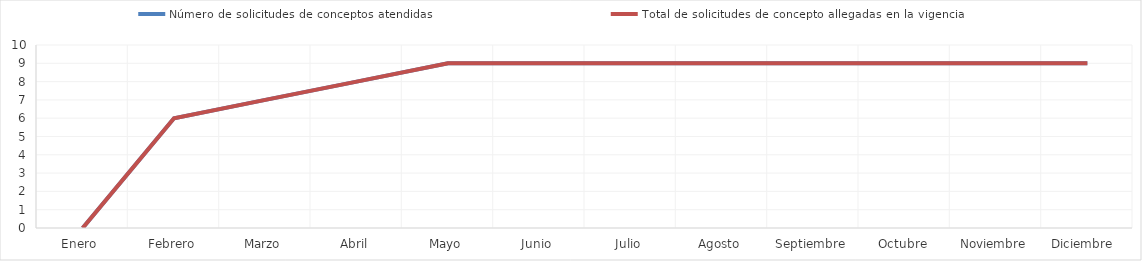
| Category | Número de solicitudes de conceptos atendidas | Total de solicitudes de concepto allegadas en la vigencia |
|---|---|---|
| Enero  | 0 | 0 |
| Febrero | 6 | 6 |
| Marzo | 7 | 7 |
| Abril | 8 | 8 |
| Mayo | 9 | 9 |
| Junio | 9 | 9 |
| Julio | 9 | 9 |
| Agosto | 9 | 9 |
| Septiembre | 9 | 9 |
| Octubre | 9 | 9 |
| Noviembre | 9 | 9 |
| Diciembre  | 9 | 9 |